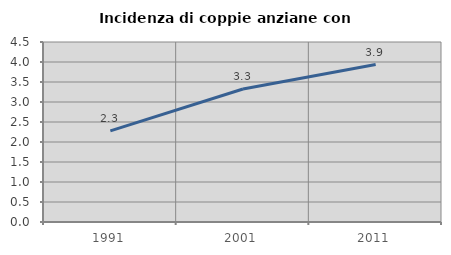
| Category | Incidenza di coppie anziane con figli |
|---|---|
| 1991.0 | 2.28 |
| 2001.0 | 3.324 |
| 2011.0 | 3.936 |